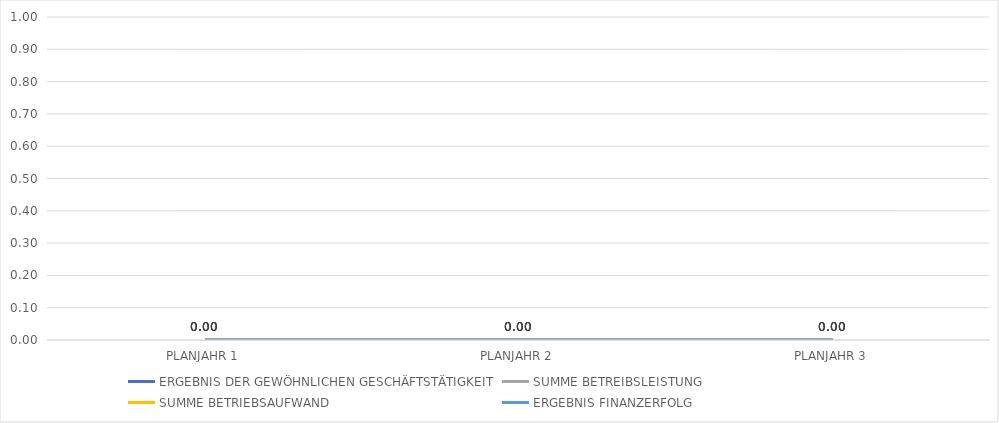
| Category | ERGEBNIS DER GEWÖHNLICHEN GESCHÄFTSTÄTIGKEIT | SUMME BETREIBSLEISTUNG | SUMME BETRIEBSAUFWAND | ERGEBNIS FINANZERFOLG |
|---|---|---|---|---|
| PLANJAHR 1 | 0 | 0 | 0 | 0 |
| PLANJAHR 2 | 0 | 0 | 0 | 0 |
| PLANJAHR 3 | 0 | 0 | 0 | 0 |